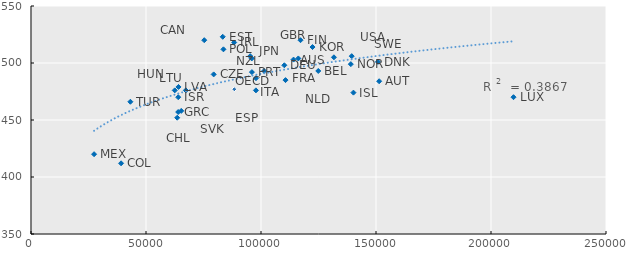
| Category | Series 0 |
|---|---|
| 114153.35399999999 | 503 |
| 151376.641 | 484 |
| 124898.63299999999 | 493 |
| 75319.50600000001 | 520 |
| 63573.915 | 452 |
| 39162.1999 | 412 |
| 79421.1008 | 490 |
| 150827.366 | 501 |
| 83365.8249 | 523 |
| 117182.68300000002 | 520 |
| 101349.04100000001 | 493 |
| 110137.46399999999 | 498 |
| 63999.6845 | 457 |
| 67331.2264 | 476 |
| 140190.068 | 474 |
| 88337.7229 | 518 |
| 64011.5959 | 470 |
| 97785.363 | 476 |
| 95987.27500000001 | 504 |
| 122395.85699999999 | 514 |
| 64126.163 | 479 |
| 62501.3725 | 476 |
| 209787.531 | 470 |
| 27423.262199999997 | 420 |
| 110657.722 | 485 |
| 95302.15699999999 | 506 |
| 139055.93 | 499 |
| 83668.1517 | 512 |
| 96039.045 | 492 |
| 65320.4207 | 458 |
| 139446.269 | 506 |
| 43208.265 | 466 |
| 116225.019 | 504 |
| 131717.758 | 505 |
| 88377.153 | 477 |
| 97818.93543999999 | 486.657 |